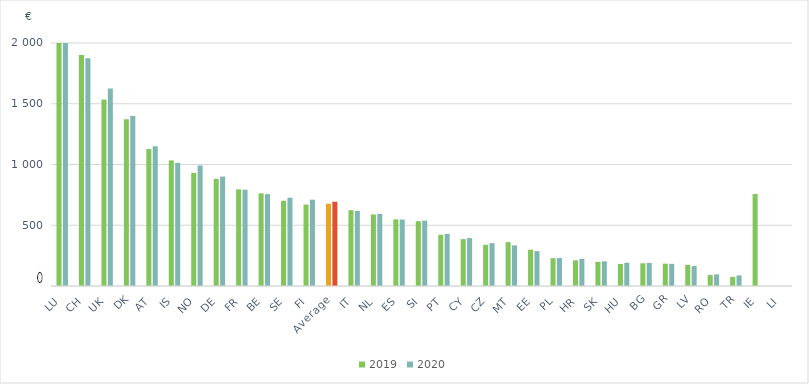
| Category | 2019 | 2020 |
|---|---|---|
| LU | 19767.246 | 20390.227 |
| CH | 1900.315 | 1875.205 |
| UK | 1535.856 | 1626.073 |
| DK | 1371.868 | 1398.188 |
| AT | 1126.905 | 1150.649 |
| IS | 1033.808 | 1013.528 |
| NO | 930.787 | 992.242 |
| DE | 881.784 | 900.625 |
| FR | 795.739 | 792.728 |
| BE | 762.737 | 756.22 |
| SE | 701.212 | 726.284 |
| FI | 670.18 | 710.37 |
| Average | 677.117 | 693.579 |
| IT | 624.127 | 617.858 |
| NL | 588.699 | 593.534 |
| ES | 548.522 | 547.276 |
| SI | 533.219 | 537.851 |
| PT | 421.527 | 428.759 |
| CY | 385.889 | 394.142 |
| CZ | 338.879 | 352.461 |
| MT | 360.808 | 334.205 |
| EE | 298.893 | 286.889 |
| PL | 229.057 | 230.972 |
| HR | 211.466 | 223.391 |
| SK | 198.701 | 203.009 |
| HU | 181.454 | 191.517 |
| BG | 186.799 | 189.766 |
| GR | 183.783 | 182.301 |
| LV | 174.065 | 164.184 |
| RO | 89.99 | 95.756 |
| TR | 74.997 | 86.678 |
| IE | 757.304 | 0 |
| LI | 0 | 0 |